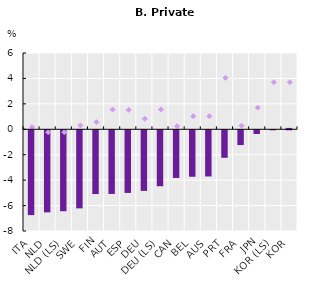
| Category | 2022 (↗) |
|---|---|
| ITA | -6.672 |
| NLD | -6.456 |
| NLD (LS) | -6.365 |
| SWE | -6.141 |
| FIN | -5.016 |
| AUT | -5.005 |
| ESP | -4.927 |
| DEU | -4.766 |
| DEU (LS) | -4.4 |
| CAN | -3.748 |
| BEL | -3.655 |
| AUS | -3.632 |
| PRT | -2.163 |
| FRA | -1.162 |
| JPN | -0.29 |
| KOR (LS) | 0.012 |
| KOR | 0.107 |